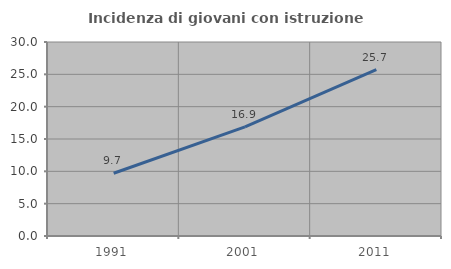
| Category | Incidenza di giovani con istruzione universitaria |
|---|---|
| 1991.0 | 9.7 |
| 2001.0 | 16.862 |
| 2011.0 | 25.734 |